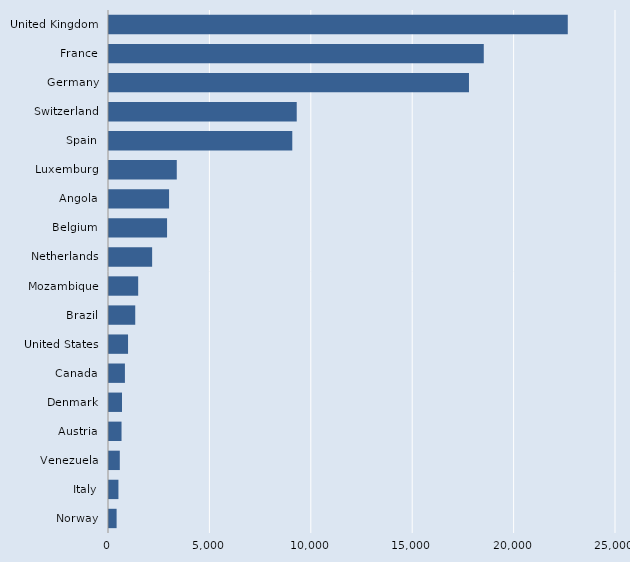
| Category | Series 0 |
|---|---|
| Norway | 375 |
| Italy | 465 |
| Venezuela | 532 |
| Austria | 618 |
| Denmark | 642 |
| Canada | 785 |
| United States | 939 |
| Brazil | 1294 |
| Mozambique | 1439 |
| Netherlands | 2127 |
| Belgium | 2863 |
| Angola | 2962 |
| Luxemburg | 3342 |
| Spain | 9038 |
| Switzerland | 9257 |
| Germany | 17750 |
| France | 18480 |
| United Kingdom | 22622 |